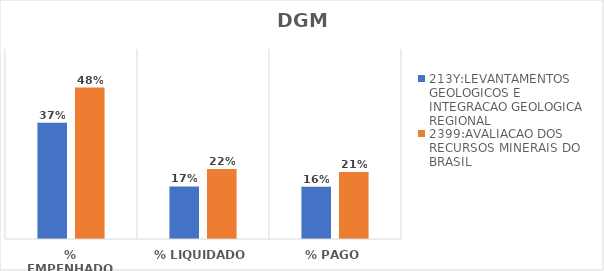
| Category | 213Y:LEVANTAMENTOS GEOLOGICOS E INTEGRACAO GEOLOGICA REGIONAL | 2399:AVALIACAO DOS RECURSOS MINERAIS DO BRASIL |
|---|---|---|
| % EMPENHADO | 0.367 | 0.478 |
| % LIQUIDADO | 0.166 | 0.221 |
| % PAGO | 0.165 | 0.212 |